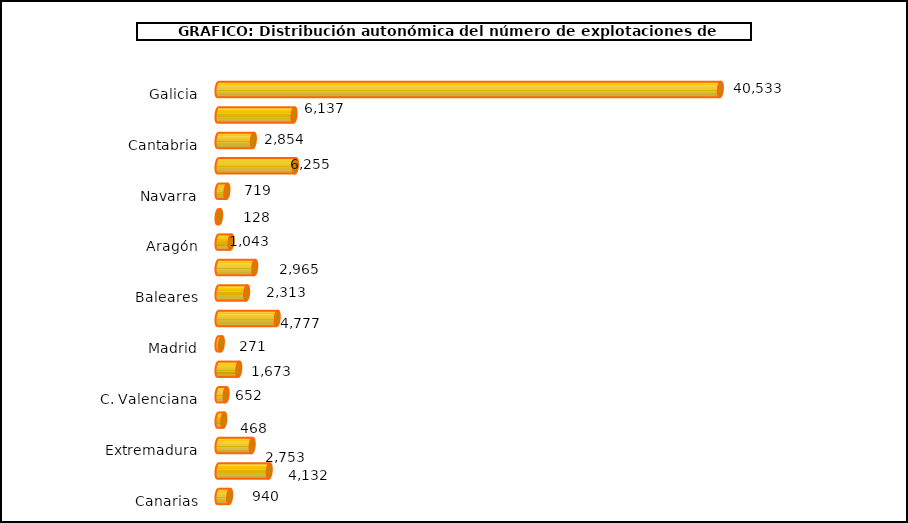
| Category | num. Explotaciones |
|---|---|
|   Galicia | 40533 |
|   P. de Asturias | 6137 |
|   Cantabria | 2854 |
|   País Vasco | 6255 |
|   Navarra | 719 |
|   La Rioja | 128 |
|   Aragón | 1043 |
|   Cataluña | 2965 |
|   Baleares | 2313 |
|   Castilla y León | 4777 |
|   Madrid | 271 |
|   Castilla – La Mancha | 1673 |
|   C. Valenciana | 652 |
|   R. de Murcia | 468 |
|   Extremadura | 2753 |
|   Andalucía | 4132 |
|   Canarias | 940 |